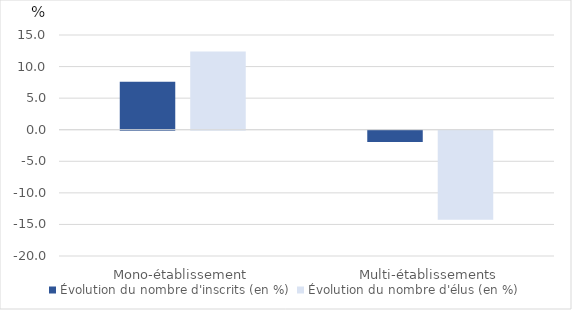
| Category | Évolution du nombre d'inscrits (en %) | Évolution du nombre d'élus (en %) |
|---|---|---|
| Mono-établissement | 7.594 | 12.4 |
| Multi-établissements | -1.789 | -14.1 |